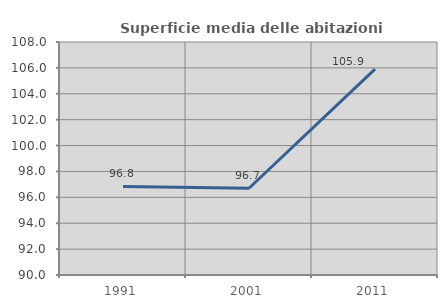
| Category | Superficie media delle abitazioni occupate |
|---|---|
| 1991.0 | 96.845 |
| 2001.0 | 96.701 |
| 2011.0 | 105.911 |